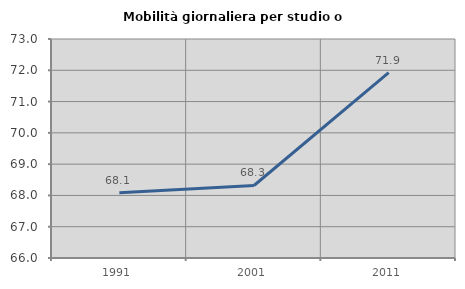
| Category | Mobilità giornaliera per studio o lavoro |
|---|---|
| 1991.0 | 68.089 |
| 2001.0 | 68.317 |
| 2011.0 | 71.926 |